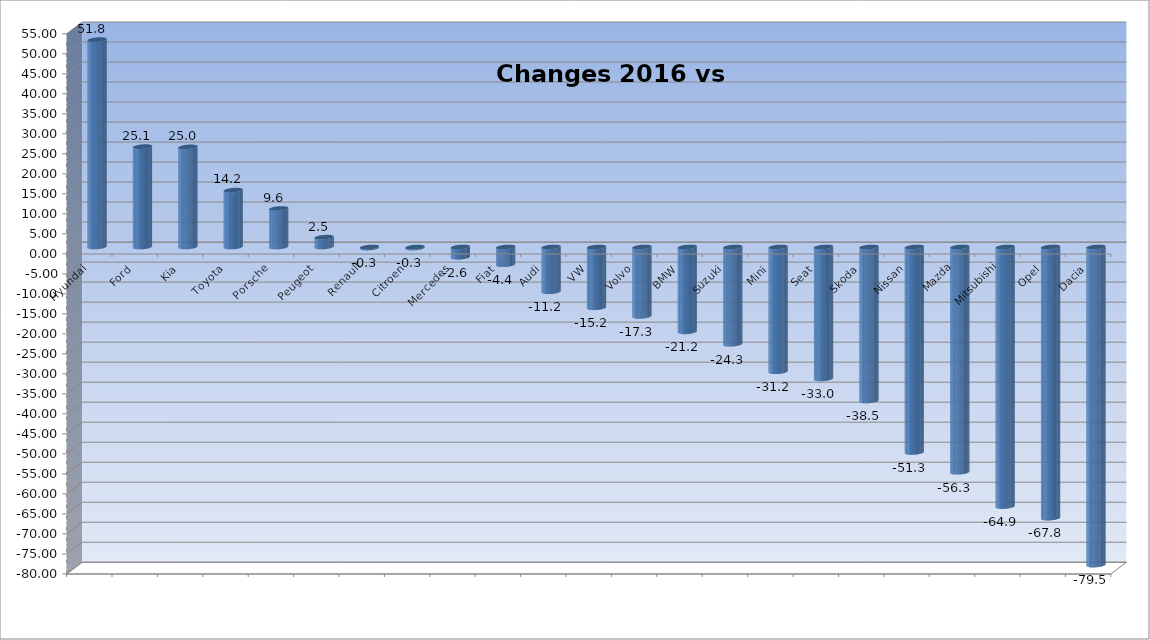
| Category | Ytd 2015 |
|---|---|
| Hyundai | 51.823 |
| Ford | 25.085 |
| Kia | 25.011 |
| Toyota | 14.207 |
| Porsche | 9.626 |
| Peugeot | 2.453 |
| Renault | -0.262 |
| Citroen | -0.27 |
| Mercedes | -2.559 |
| Fiat | -4.428 |
| Audi | -11.186 |
| VW | -15.187 |
| Volvo | -17.335 |
| BMW | -21.198 |
| Suzuki | -24.299 |
| Mini | -31.173 |
| Seat | -32.955 |
| Skoda | -38.466 |
| Nissan | -51.342 |
| Mazda | -56.289 |
| Mitsubishi | -64.871 |
| Opel | -67.755 |
| Dacia | -79.484 |